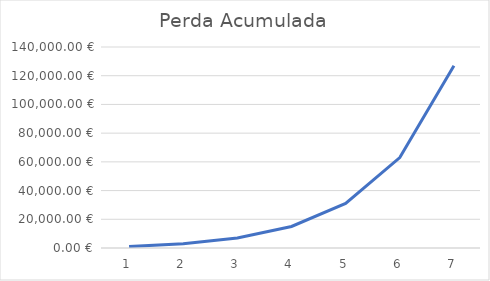
| Category | Perda Acumulada |
|---|---|
| 0 | 1000 |
| 1 | 3000 |
| 2 | 7000 |
| 3 | 15000 |
| 4 | 31000 |
| 5 | 63000 |
| 6 | 127000 |